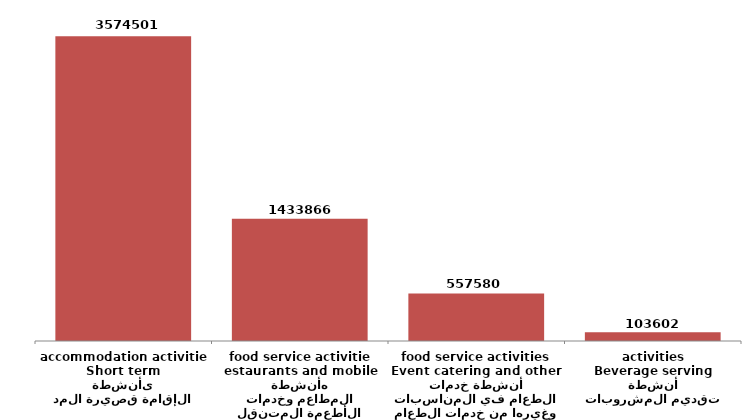
| Category | Series 0 |
|---|---|
| أنشطة الإقامة قصيرة المدى
Short term accommodation activities | 3574501 |
| أنشطة المطاعم وخدمات الأطعمة المتنقله
estaurants and mobile food service activities | 1433866 |
| أنشطة خدمات الطعام في المناسبات وغيرها من خدمات الطعام
Event catering and other food service activities | 557580 |
| أنشطة تقديم المشروبات
Beverage serving activities | 103602 |